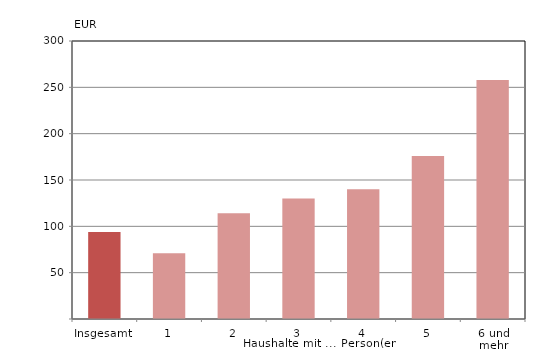
| Category | Series 0 |
|---|---|
| Insgesamt | 94 |
| 1 | 71 |
| 2 | 114 |
| 3 | 130 |
| 4 | 140 |
| 5 | 176 |
| 6 und mehr | 258 |